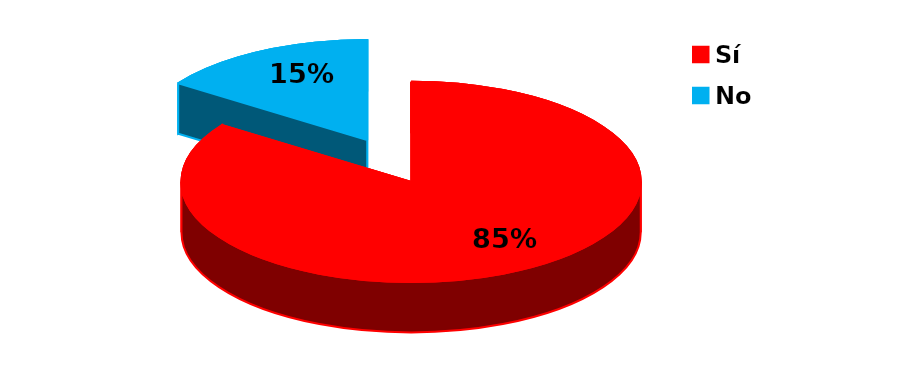
| Category | Series 0 |
|---|---|
| Sí | 33 |
| No | 6 |